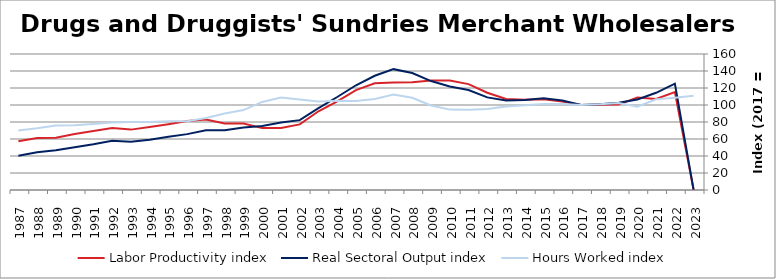
| Category | Labor Productivity index | Real Sectoral Output index | Hours Worked index |
|---|---|---|---|
| 2023.0 | 0 | 0 | 110.976 |
| 2022.0 | 115.123 | 125.061 | 108.633 |
| 2021.0 | 107.14 | 114.335 | 106.716 |
| 2020.0 | 108.712 | 106.554 | 98.015 |
| 2019.0 | 100.465 | 102.749 | 102.274 |
| 2018.0 | 100.15 | 100.892 | 100.741 |
| 2017.0 | 100 | 100 | 100 |
| 2016.0 | 103.979 | 105.235 | 101.208 |
| 2015.0 | 106.763 | 107.946 | 101.108 |
| 2014.0 | 106.135 | 105.854 | 99.735 |
| 2013.0 | 107.158 | 105.254 | 98.224 |
| 2012.0 | 114.432 | 108.944 | 95.205 |
| 2011.0 | 124.57 | 117.675 | 94.465 |
| 2010.0 | 128.871 | 121.864 | 94.562 |
| 2009.0 | 128.874 | 128.135 | 99.427 |
| 2008.0 | 126.844 | 137.59 | 108.472 |
| 2007.0 | 126.479 | 142.176 | 112.411 |
| 2006.0 | 125.553 | 134.378 | 107.029 |
| 2005.0 | 117.598 | 123.223 | 104.784 |
| 2004.0 | 104.323 | 109.416 | 104.882 |
| 2003.0 | 92.585 | 96.294 | 104.006 |
| 2002.0 | 77.142 | 82.179 | 106.529 |
| 2001.0 | 72.94 | 79.455 | 108.933 |
| 2000.0 | 72.798 | 75.421 | 103.603 |
| 1999.0 | 78.19 | 73.505 | 94.008 |
| 1998.0 | 78.254 | 70.367 | 89.921 |
| 1997.0 | 82.926 | 70.264 | 84.731 |
| 1996.0 | 81.185 | 65.74 | 80.975 |
| 1995.0 | 77.429 | 62.677 | 80.948 |
| 1994.0 | 74.022 | 59.121 | 79.869 |
| 1993.0 | 71.038 | 56.833 | 80.004 |
| 1992.0 | 72.913 | 57.947 | 79.474 |
| 1991.0 | 69.283 | 53.857 | 77.735 |
| 1990.0 | 65.949 | 50.286 | 76.25 |
| 1989.0 | 61.425 | 46.677 | 75.99 |
| 1988.0 | 61.038 | 44.326 | 72.62 |
| 1987.0 | 57.334 | 40.179 | 70.08 |